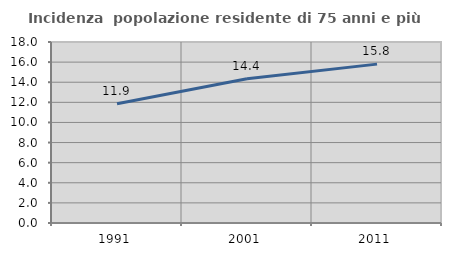
| Category | Incidenza  popolazione residente di 75 anni e più |
|---|---|
| 1991.0 | 11.855 |
| 2001.0 | 14.355 |
| 2011.0 | 15.8 |